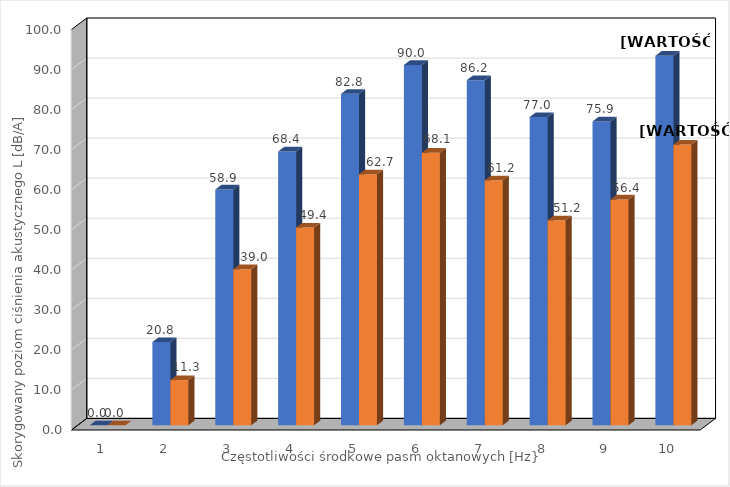
| Category | Series 0 | Series 1 |
|---|---|---|
| 0 | 0 | 0 |
| 1 | 20.8 | 11.3 |
| 2 | 58.9 | 39 |
| 3 | 68.4 | 49.4 |
| 4 | 82.8 | 62.7 |
| 5 | 90 | 68.1 |
| 6 | 86.2 | 61.2 |
| 7 | 77 | 51.2 |
| 8 | 75.9 | 56.4 |
| 9 | 92.315 | 70.128 |